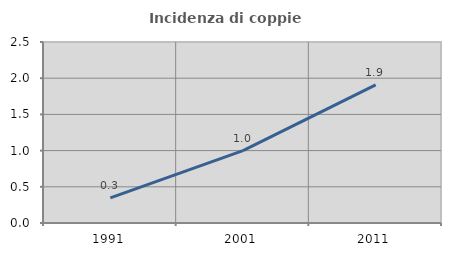
| Category | Incidenza di coppie miste |
|---|---|
| 1991.0 | 0.347 |
| 2001.0 | 1 |
| 2011.0 | 1.907 |